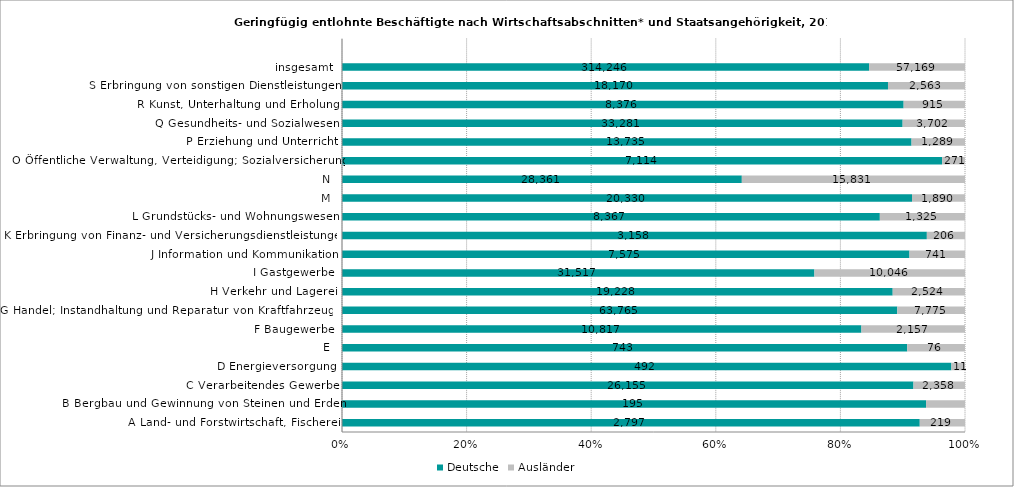
| Category | Deutsche | Ausländer |
|---|---|---|
| A Land- und Forstwirtschaft, Fischerei | 2797 | 219 |
| B Bergbau und Gewinnung von Steinen und Erden | 195 | 13 |
| C Verarbeitendes Gewerbe | 26155 | 2358 |
| D Energieversorgung | 492 | 11 |
| E | 743 | 76 |
| F Baugewerbe | 10817 | 2157 |
| G Handel; Instandhaltung und Reparatur von Kraftfahrzeugen | 63765 | 7775 |
| H Verkehr und Lagerei | 19228 | 2524 |
| I Gastgewerbe | 31517 | 10046 |
| J Information und Kommunikation | 7575 | 741 |
| K Erbringung von Finanz- und Versicherungsdienstleistungen | 3158 | 206 |
| L Grundstücks- und Wohnungswesen | 8367 | 1325 |
| M | 20330 | 1890 |
| N | 28361 | 15831 |
| O Öffentliche Verwaltung, Verteidigung; Sozialversicherung | 7114 | 271 |
| P Erziehung und Unterricht | 13735 | 1289 |
| Q Gesundheits- und Sozialwesen | 33281 | 3702 |
| R Kunst, Unterhaltung und Erholung | 8376 | 915 |
| S Erbringung von sonstigen Dienstleistungen | 18170 | 2563 |
| insgesamt | 314246 | 57169 |